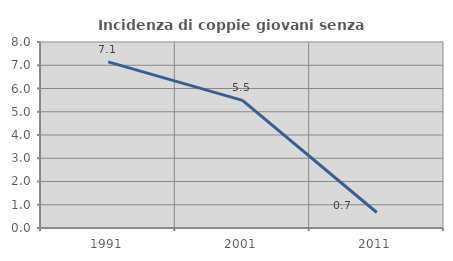
| Category | Incidenza di coppie giovani senza figli |
|---|---|
| 1991.0 | 7.143 |
| 2001.0 | 5.488 |
| 2011.0 | 0.667 |